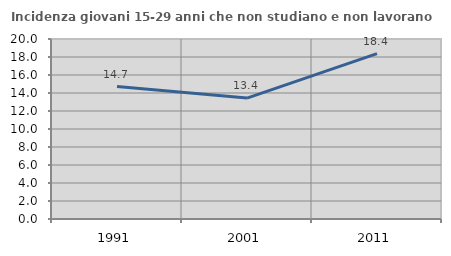
| Category | Incidenza giovani 15-29 anni che non studiano e non lavorano  |
|---|---|
| 1991.0 | 14.716 |
| 2001.0 | 13.433 |
| 2011.0 | 18.382 |